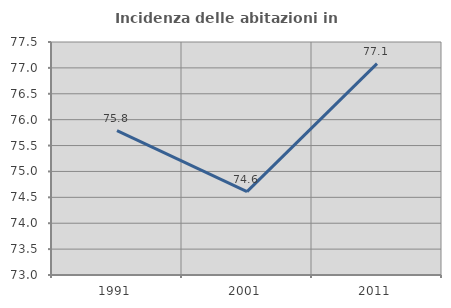
| Category | Incidenza delle abitazioni in proprietà  |
|---|---|
| 1991.0 | 75.789 |
| 2001.0 | 74.611 |
| 2011.0 | 77.083 |